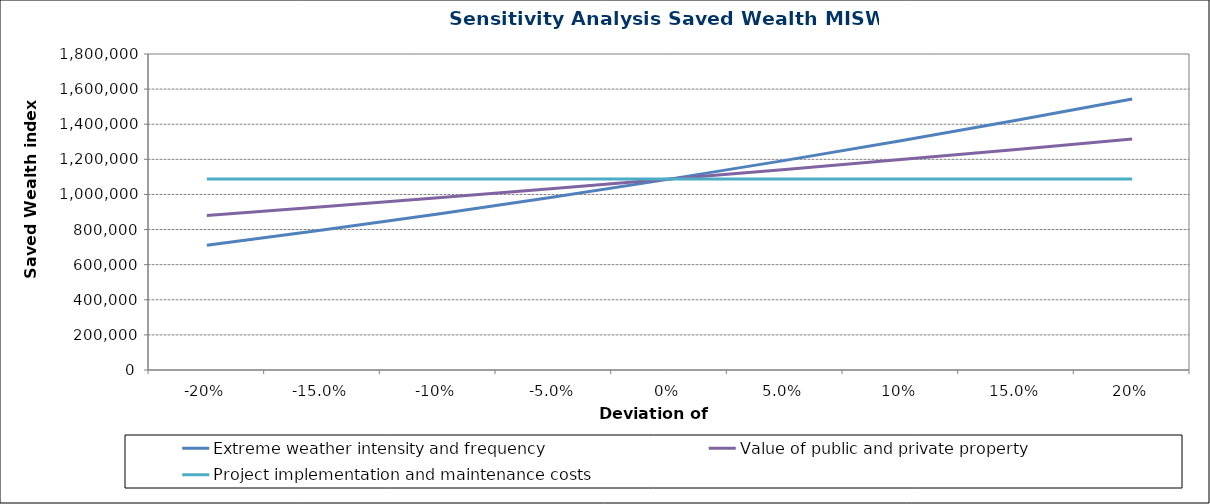
| Category | Extreme weather intensity and frequency | Value of public and private property | Project implementation and maintenance costs |
|---|---|---|---|
| -0.2 | 710632.002 | 880742.994 | 1087337.029 |
| -0.15 | 797325.902 | 930352.746 | 1087337.029 |
| -0.1 | 889008.039 | 981321.669 | 1087337.029 |
| -0.05 | 985678.415 | 1033649.764 | 1087337.029 |
| 0.0 | 1087337.029 | 1087337.029 | 1087337.029 |
| 0.05 | 1193983.881 | 1142383.467 | 1087337.029 |
| 0.1 | 1305618.971 | 1198789.075 | 1087337.029 |
| 0.15 | 1422242.299 | 1256553.855 | 1087337.029 |
| 0.2 | 1543853.865 | 1315677.806 | 1087337.029 |